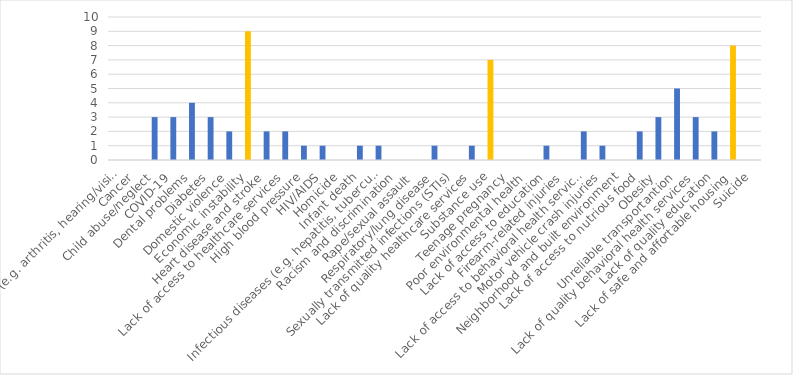
| Category | Number of Responses |
|---|---|
| Aging problems (e.g. arthritis, hearing/vision loss, etc.) | 0 |
| Cancer | 0 |
| Child abuse/neglect | 3 |
| COVID-19 | 3 |
| Dental problems | 4 |
| Diabetes | 3 |
| Domestic violence | 2 |
| Economic instability | 9 |
| Heart disease and stroke | 2 |
| Lack of access to healthcare services | 2 |
| High blood pressure | 1 |
| HIV/AIDS | 1 |
| Homicide | 0 |
| Infant death | 1 |
| Infectious diseases (e.g. hepatitis, tuberculosis, etc.) | 1 |
| Racism and discrimination | 0 |
| Rape/sexual assault | 0 |
| Respiratory/lung disease | 1 |
| Sexually transmitted infections (STIs) | 0 |
| Lack of quality healthcare services | 1 |
| Substance use | 7 |
| Teenage pregnancy | 0 |
| Poor environmental health | 0 |
| Lack of access to education | 1 |
| Firearm-related injuries | 0 |
| Lack of access to behavioral health services | 2 |
| Motor vehicle crash injuries | 1 |
| Neighborhood and built environment | 0 |
| Lack of access to nutrious food | 2 |
| Obesity | 3 |
| Unreliable transportantion | 5 |
| Lack of quality behavioral health services | 3 |
| Lack of quality education | 2 |
| Lack of safe and affortable housing | 8 |
| Suicide | 0 |